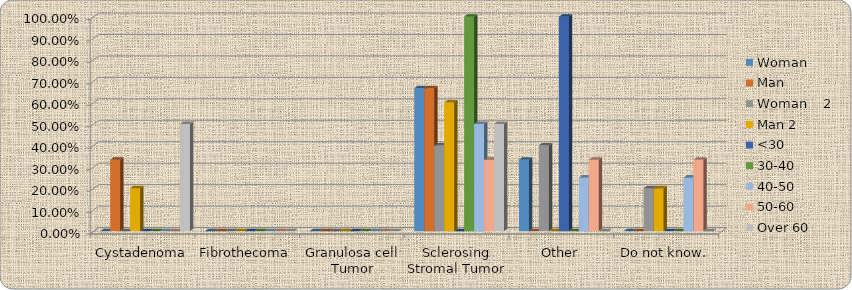
| Category | Woman     | Man  | Woman    2 | Man 2 | <30 | 30-40 | 40-50 | 50-60 | Over 60 |
|---|---|---|---|---|---|---|---|---|---|
| Cystadenoma | 0 | 0.333 | 0 | 0.2 | 0 | 0 | 0 | 0 | 0.5 |
| Fibrothecoma | 0 | 0 | 0 | 0 | 0 | 0 | 0 | 0 | 0 |
| Granulosa cell Tumor | 0 | 0 | 0 | 0 | 0 | 0 | 0 | 0 | 0 |
| Sclerosing Stromal Tumor | 0.667 | 0.667 | 0.4 | 0.6 | 0 | 1 | 0.5 | 0.333 | 0.5 |
| Other | 0.333 | 0 | 0.4 | 0 | 1 | 0 | 0.25 | 0.333 | 0 |
| Do not know. | 0 | 0 | 0.2 | 0.2 | 0 | 0 | 0.25 | 0.333 | 0 |